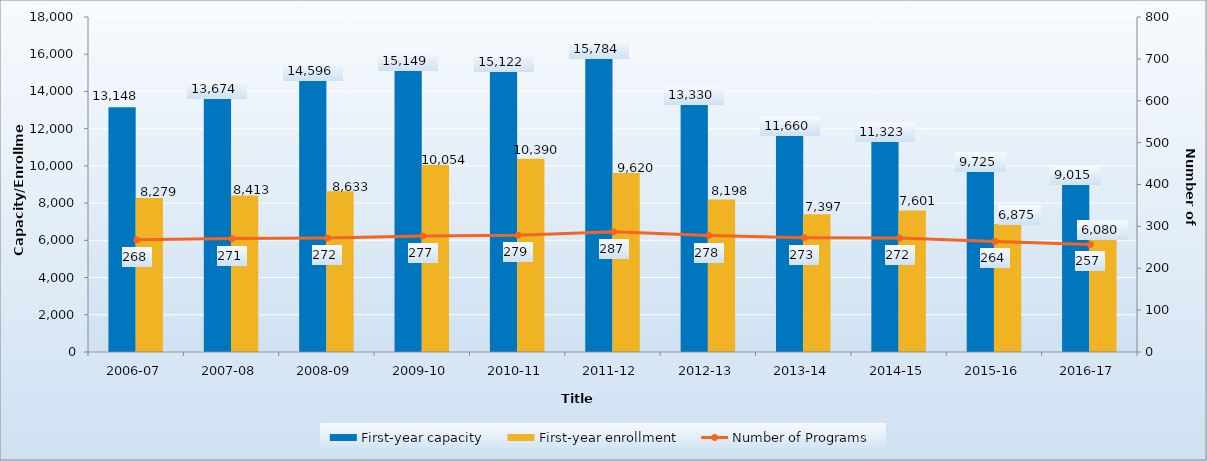
| Category | First-year capacity | First-year enrollment |
|---|---|---|
| 2006-07 | 13148 | 8279 |
| 2007-08 | 13674 | 8413 |
| 2008-09 | 14596 | 8633 |
| 2009-10 | 15149 | 10054 |
| 2010-11 | 15122 | 10390 |
| 2011-12 | 15784 | 9620 |
| 2012-13 | 13330 | 8198 |
| 2013-14 | 11660 | 7397 |
| 2014-15 | 11323 | 7601 |
| 2015-16 | 9725 | 6875 |
| 2016-17 | 9015 | 6080 |